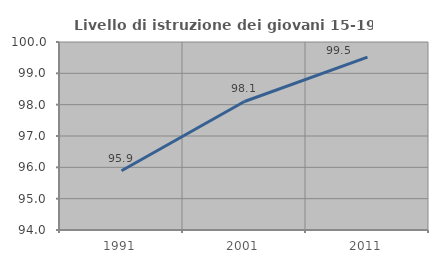
| Category | Livello di istruzione dei giovani 15-19 anni |
|---|---|
| 1991.0 | 95.89 |
| 2001.0 | 98.101 |
| 2011.0 | 99.515 |